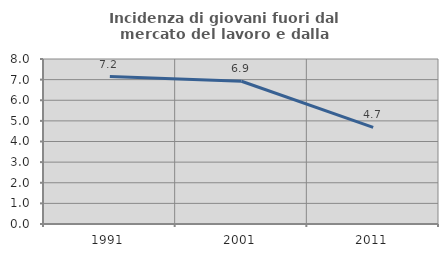
| Category | Incidenza di giovani fuori dal mercato del lavoro e dalla formazione  |
|---|---|
| 1991.0 | 7.151 |
| 2001.0 | 6.919 |
| 2011.0 | 4.682 |